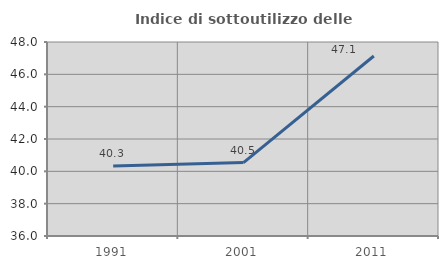
| Category | Indice di sottoutilizzo delle abitazioni  |
|---|---|
| 1991.0 | 40.323 |
| 2001.0 | 40.541 |
| 2011.0 | 47.134 |